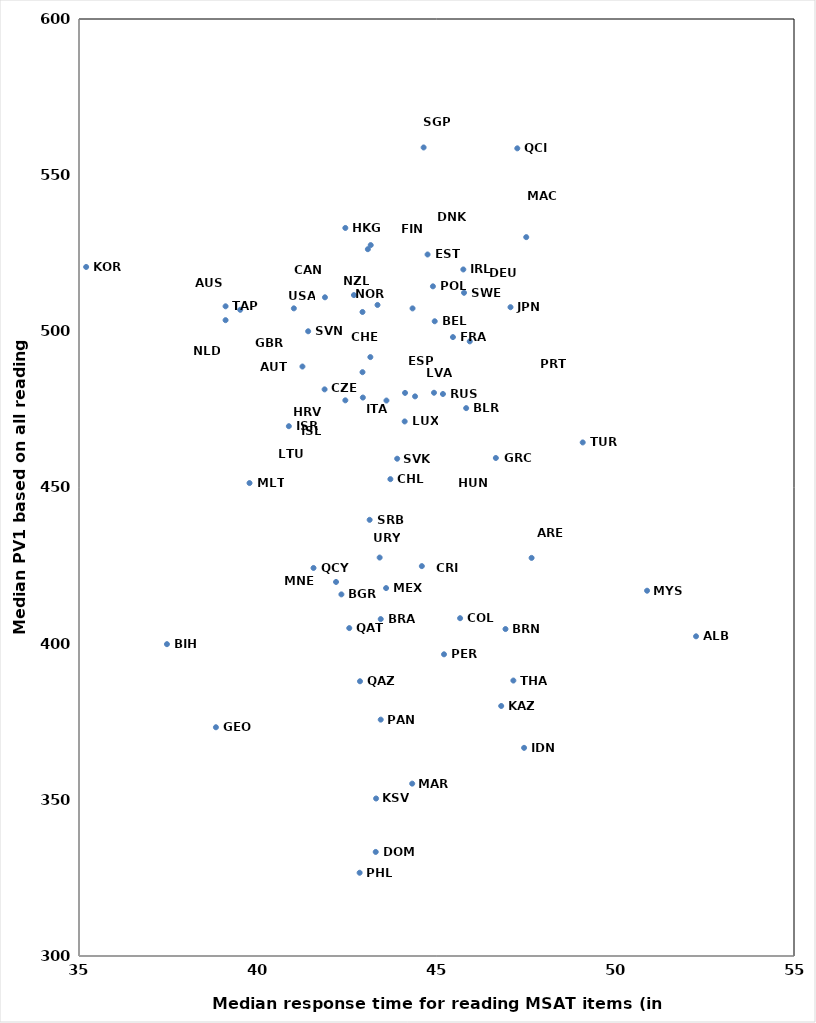
| Category | Countries |
|---|---|
| 52.26 | 402.357 |
| 47.66 | 427.462 |
| 39.51 | 506.895 |
| 41.25 | 488.731 |
| 44.95 | 503.224 |
| 42.34 | 415.777 |
| 37.46 | 399.839 |
| 45.83 | 475.414 |
| 43.44 | 407.87 |
| 46.93 | 404.681 |
| 43.08 | 526.301 |
| 42.93 | 486.922 |
| 43.71 | 452.672 |
| 45.66 | 408.153 |
| 44.59 | 424.827 |
| 43.15 | 491.756 |
| 44.33 | 507.345 |
| 43.35 | 508.447 |
| 43.3 | 333.32 |
| 44.4 | 479.178 |
| 44.75 | 524.605 |
| 43.16 | 527.61 |
| 45.46 | 498.154 |
| 41.01 | 507.358 |
| 38.83 | 373.237 |
| 46.66 | 459.45 |
| 42.45 | 533.097 |
| 41.87 | 481.419 |
| 43.6 | 477.841 |
| 47.45 | 366.642 |
| 45.75 | 519.812 |
| 42.94 | 478.801 |
| 40.87 | 469.627 |
| 44.93 | 480.337 |
| 47.07 | 507.726 |
| 46.81 | 380.052 |
| 35.2 | 520.613 |
| 43.31 | 350.427 |
| 42.45 | 477.905 |
| 44.11 | 471.148 |
| 44.12 | 480.288 |
| 47.51 | 530.159 |
| 44.32 | 355.185 |
| 43.59 | 417.796 |
| 39.77 | 451.424 |
| 42.19 | 419.759 |
| 50.89 | 416.954 |
| 39.1 | 503.575 |
| 42.93 | 506.19 |
| 42.69 | 511.604 |
| 43.44 | 375.676 |
| 45.21 | 396.593 |
| 42.85 | 326.655 |
| 44.9 | 514.408 |
| 45.93 | 496.785 |
| 42.56 | 404.985 |
| 42.86 | 387.958 |
| 47.26 | 558.588 |
| 41.56 | 424.236 |
| 45.18 | 479.936 |
| 44.64 | 558.869 |
| 43.13 | 439.646 |
| 43.9 | 459.217 |
| 41.41 | 500.017 |
| 45.77 | 512.342 |
| 39.1 | 508.015 |
| 47.15 | 388.19 |
| 49.09 | 464.428 |
| 43.41 | 427.572 |
| 41.88 | 510.896 |